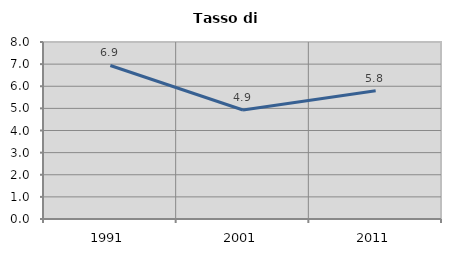
| Category | Tasso di disoccupazione   |
|---|---|
| 1991.0 | 6.939 |
| 2001.0 | 4.925 |
| 2011.0 | 5.797 |